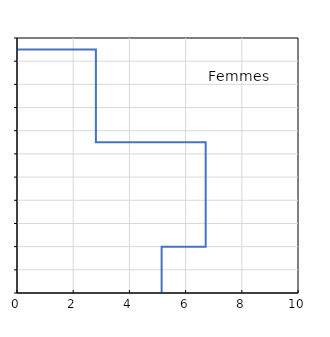
| Category | Femmes |
|---|---|
| 5.147058823529411 | 0 |
| 5.147058823529411 | 20 |
| 6.71420083184789 | 20 |
| 6.71420083184789 | 65 |
| 2.807486631016043 | 65 |
| 2.807486631016043 | 105 |
| 0.0 | 105 |